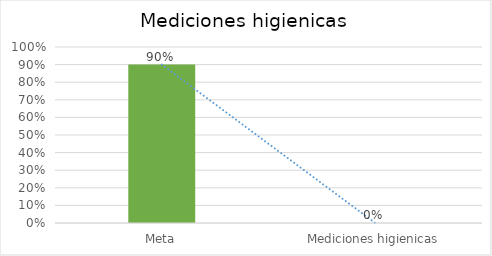
| Category | Series 0 |
|---|---|
| Meta | 0.9 |
| Mediciones higienicas | 0 |